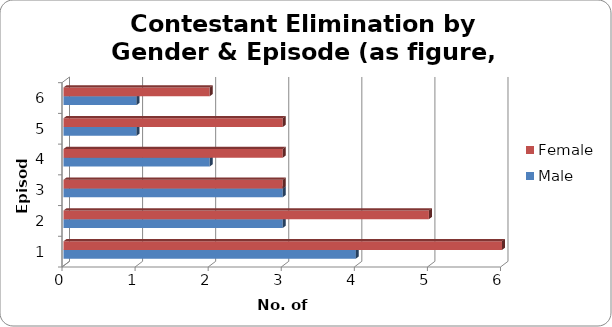
| Category | Male | Female |
|---|---|---|
| 0 | 4 | 6 |
| 1 | 3 | 5 |
| 2 | 3 | 3 |
| 3 | 2 | 3 |
| 4 | 1 | 3 |
| 5 | 1 | 2 |